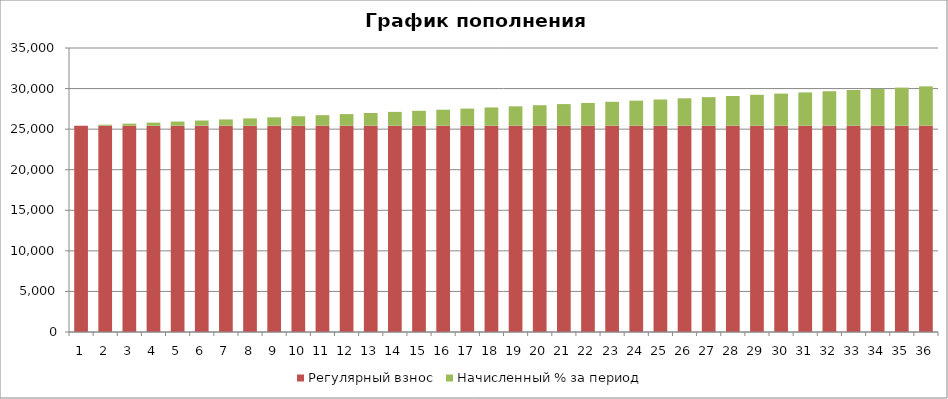
| Category | Регулярный взнос | Начисленный % за период |
|---|---|---|
| 1.0 | 25421.937 | 0 |
| 2.0 | 25421.937 | 127.11 |
| 3.0 | 25421.937 | 254.855 |
| 4.0 | 25421.937 | 383.239 |
| 5.0 | 25421.937 | 512.265 |
| 6.0 | 25421.937 | 641.936 |
| 7.0 | 25421.937 | 772.255 |
| 8.0 | 25421.937 | 903.226 |
| 9.0 | 25421.937 | 1034.852 |
| 10.0 | 25421.937 | 1167.136 |
| 11.0 | 25421.937 | 1300.081 |
| 12.0 | 25421.937 | 1433.691 |
| 13.0 | 25421.937 | 1567.969 |
| 14.0 | 25421.937 | 1702.919 |
| 15.0 | 25421.937 | 1838.543 |
| 16.0 | 25421.937 | 1974.846 |
| 17.0 | 25421.937 | 2111.83 |
| 18.0 | 25421.937 | 2249.498 |
| 19.0 | 25421.937 | 2387.856 |
| 20.0 | 25421.937 | 2526.905 |
| 21.0 | 25421.937 | 2666.649 |
| 22.0 | 25421.937 | 2807.092 |
| 23.0 | 25421.937 | 2948.237 |
| 24.0 | 25421.937 | 3090.088 |
| 25.0 | 25421.937 | 3232.648 |
| 26.0 | 25421.937 | 3375.921 |
| 27.0 | 25421.937 | 3519.91 |
| 28.0 | 25421.937 | 3664.619 |
| 29.0 | 25421.937 | 3810.052 |
| 30.0 | 25421.937 | 3956.212 |
| 31.0 | 25421.937 | 4103.103 |
| 32.0 | 25421.937 | 4250.728 |
| 33.0 | 25421.937 | 4399.091 |
| 34.0 | 25421.937 | 4548.196 |
| 35.0 | 25421.937 | 4698.047 |
| 36.0 | 25421.937 | 4848.647 |